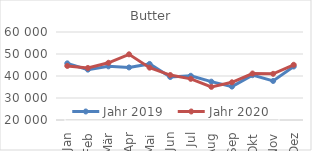
| Category | Jahr 2019 | Jahr 2020 |
|---|---|---|
| Jan | 45749.808 | 44575.644 |
| Feb | 42898.561 | 43640.602 |
| Mär | 44387.031 | 46011.061 |
| Apr | 43894.582 | 49857.536 |
| Mai | 45481.346 | 43801.253 |
| Jun | 39548.014 | 40435.389 |
| Jul | 40097.604 | 38713.07 |
| Aug | 37423.749 | 35060.534 |
| Sep | 35188.358 | 37133.098 |
| Okt | 40380.144 | 41132.766 |
| Nov | 37745.336 | 40983.857 |
| Dez | 44314.595 | 45096.085 |